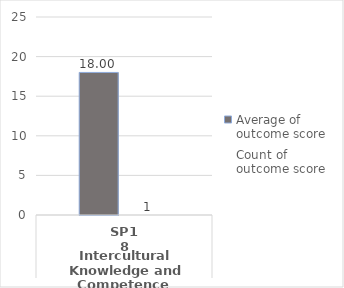
| Category | PTA.AAS - Average of outcome score | PTA.AAS - Count of outcome score |
|---|---|---|
| 0 | 18 | 1 |